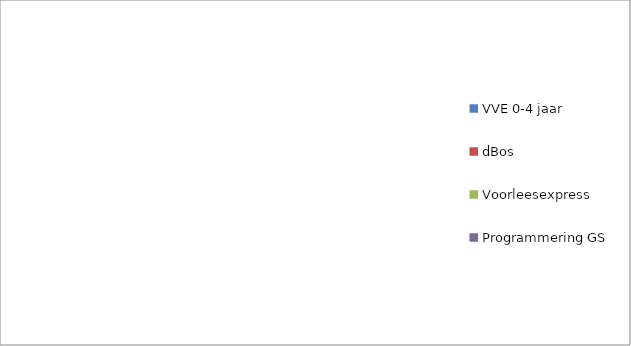
| Category | Series 0 |
|---|---|
| VVE 0-4 jaar | 0 |
| dBos | 0 |
| Voorleesexpress | 0 |
| Programmering GS | 0 |